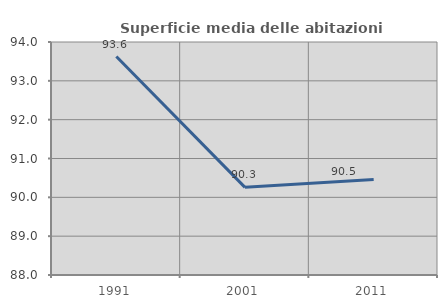
| Category | Superficie media delle abitazioni occupate |
|---|---|
| 1991.0 | 93.625 |
| 2001.0 | 90.258 |
| 2011.0 | 90.46 |